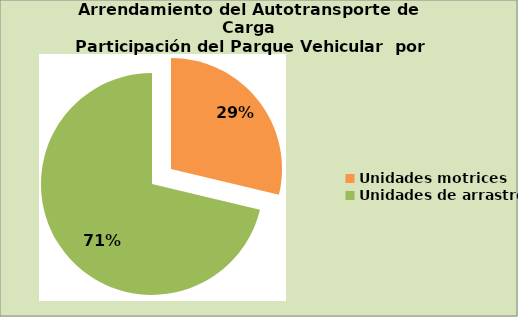
| Category | Series 0 |
|---|---|
| Unidades motrices | 28.744 |
| Unidades de arrastre | 71.256 |